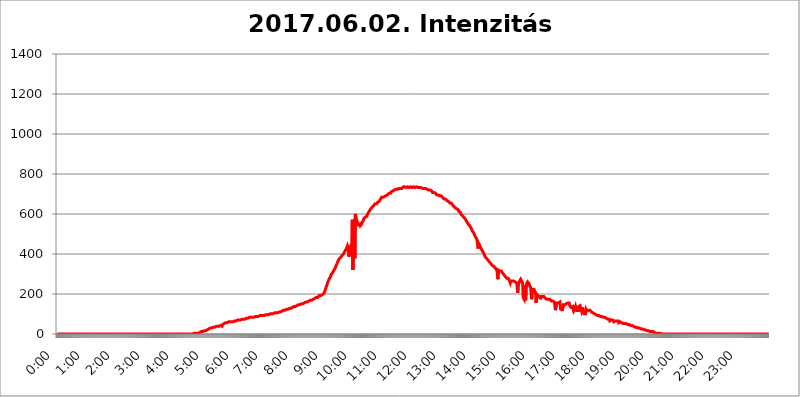
| Category | 2017.06.02. Intenzitás [W/m^2] |
|---|---|
| 0.0 | 0 |
| 0.0006944444444444445 | 0 |
| 0.001388888888888889 | 0 |
| 0.0020833333333333333 | 0 |
| 0.002777777777777778 | 0 |
| 0.003472222222222222 | 0 |
| 0.004166666666666667 | 0 |
| 0.004861111111111111 | 0 |
| 0.005555555555555556 | 0 |
| 0.0062499999999999995 | 0 |
| 0.006944444444444444 | 0 |
| 0.007638888888888889 | 0 |
| 0.008333333333333333 | 0 |
| 0.009027777777777779 | 0 |
| 0.009722222222222222 | 0 |
| 0.010416666666666666 | 0 |
| 0.011111111111111112 | 0 |
| 0.011805555555555555 | 0 |
| 0.012499999999999999 | 0 |
| 0.013194444444444444 | 0 |
| 0.013888888888888888 | 0 |
| 0.014583333333333332 | 0 |
| 0.015277777777777777 | 0 |
| 0.015972222222222224 | 0 |
| 0.016666666666666666 | 0 |
| 0.017361111111111112 | 0 |
| 0.018055555555555557 | 0 |
| 0.01875 | 0 |
| 0.019444444444444445 | 0 |
| 0.02013888888888889 | 0 |
| 0.020833333333333332 | 0 |
| 0.02152777777777778 | 0 |
| 0.022222222222222223 | 0 |
| 0.02291666666666667 | 0 |
| 0.02361111111111111 | 0 |
| 0.024305555555555556 | 0 |
| 0.024999999999999998 | 0 |
| 0.025694444444444447 | 0 |
| 0.02638888888888889 | 0 |
| 0.027083333333333334 | 0 |
| 0.027777777777777776 | 0 |
| 0.02847222222222222 | 0 |
| 0.029166666666666664 | 0 |
| 0.029861111111111113 | 0 |
| 0.030555555555555555 | 0 |
| 0.03125 | 0 |
| 0.03194444444444445 | 0 |
| 0.03263888888888889 | 0 |
| 0.03333333333333333 | 0 |
| 0.034027777777777775 | 0 |
| 0.034722222222222224 | 0 |
| 0.035416666666666666 | 0 |
| 0.036111111111111115 | 0 |
| 0.03680555555555556 | 0 |
| 0.0375 | 0 |
| 0.03819444444444444 | 0 |
| 0.03888888888888889 | 0 |
| 0.03958333333333333 | 0 |
| 0.04027777777777778 | 0 |
| 0.04097222222222222 | 0 |
| 0.041666666666666664 | 0 |
| 0.042361111111111106 | 0 |
| 0.04305555555555556 | 0 |
| 0.043750000000000004 | 0 |
| 0.044444444444444446 | 0 |
| 0.04513888888888889 | 0 |
| 0.04583333333333334 | 0 |
| 0.04652777777777778 | 0 |
| 0.04722222222222222 | 0 |
| 0.04791666666666666 | 0 |
| 0.04861111111111111 | 0 |
| 0.049305555555555554 | 0 |
| 0.049999999999999996 | 0 |
| 0.05069444444444445 | 0 |
| 0.051388888888888894 | 0 |
| 0.052083333333333336 | 0 |
| 0.05277777777777778 | 0 |
| 0.05347222222222222 | 0 |
| 0.05416666666666667 | 0 |
| 0.05486111111111111 | 0 |
| 0.05555555555555555 | 0 |
| 0.05625 | 0 |
| 0.05694444444444444 | 0 |
| 0.057638888888888885 | 0 |
| 0.05833333333333333 | 0 |
| 0.05902777777777778 | 0 |
| 0.059722222222222225 | 0 |
| 0.06041666666666667 | 0 |
| 0.061111111111111116 | 0 |
| 0.06180555555555556 | 0 |
| 0.0625 | 0 |
| 0.06319444444444444 | 0 |
| 0.06388888888888888 | 0 |
| 0.06458333333333334 | 0 |
| 0.06527777777777778 | 0 |
| 0.06597222222222222 | 0 |
| 0.06666666666666667 | 0 |
| 0.06736111111111111 | 0 |
| 0.06805555555555555 | 0 |
| 0.06874999999999999 | 0 |
| 0.06944444444444443 | 0 |
| 0.07013888888888889 | 0 |
| 0.07083333333333333 | 0 |
| 0.07152777777777779 | 0 |
| 0.07222222222222223 | 0 |
| 0.07291666666666667 | 0 |
| 0.07361111111111111 | 0 |
| 0.07430555555555556 | 0 |
| 0.075 | 0 |
| 0.07569444444444444 | 0 |
| 0.0763888888888889 | 0 |
| 0.07708333333333334 | 0 |
| 0.07777777777777778 | 0 |
| 0.07847222222222222 | 0 |
| 0.07916666666666666 | 0 |
| 0.0798611111111111 | 0 |
| 0.08055555555555556 | 0 |
| 0.08125 | 0 |
| 0.08194444444444444 | 0 |
| 0.08263888888888889 | 0 |
| 0.08333333333333333 | 0 |
| 0.08402777777777777 | 0 |
| 0.08472222222222221 | 0 |
| 0.08541666666666665 | 0 |
| 0.08611111111111112 | 0 |
| 0.08680555555555557 | 0 |
| 0.08750000000000001 | 0 |
| 0.08819444444444445 | 0 |
| 0.08888888888888889 | 0 |
| 0.08958333333333333 | 0 |
| 0.09027777777777778 | 0 |
| 0.09097222222222222 | 0 |
| 0.09166666666666667 | 0 |
| 0.09236111111111112 | 0 |
| 0.09305555555555556 | 0 |
| 0.09375 | 0 |
| 0.09444444444444444 | 0 |
| 0.09513888888888888 | 0 |
| 0.09583333333333333 | 0 |
| 0.09652777777777777 | 0 |
| 0.09722222222222222 | 0 |
| 0.09791666666666667 | 0 |
| 0.09861111111111111 | 0 |
| 0.09930555555555555 | 0 |
| 0.09999999999999999 | 0 |
| 0.10069444444444443 | 0 |
| 0.1013888888888889 | 0 |
| 0.10208333333333335 | 0 |
| 0.10277777777777779 | 0 |
| 0.10347222222222223 | 0 |
| 0.10416666666666667 | 0 |
| 0.10486111111111111 | 0 |
| 0.10555555555555556 | 0 |
| 0.10625 | 0 |
| 0.10694444444444444 | 0 |
| 0.1076388888888889 | 0 |
| 0.10833333333333334 | 0 |
| 0.10902777777777778 | 0 |
| 0.10972222222222222 | 0 |
| 0.1111111111111111 | 0 |
| 0.11180555555555556 | 0 |
| 0.11180555555555556 | 0 |
| 0.1125 | 0 |
| 0.11319444444444444 | 0 |
| 0.11388888888888889 | 0 |
| 0.11458333333333333 | 0 |
| 0.11527777777777777 | 0 |
| 0.11597222222222221 | 0 |
| 0.11666666666666665 | 0 |
| 0.1173611111111111 | 0 |
| 0.11805555555555557 | 0 |
| 0.11944444444444445 | 0 |
| 0.12013888888888889 | 0 |
| 0.12083333333333333 | 0 |
| 0.12152777777777778 | 0 |
| 0.12222222222222223 | 0 |
| 0.12291666666666667 | 0 |
| 0.12291666666666667 | 0 |
| 0.12361111111111112 | 0 |
| 0.12430555555555556 | 0 |
| 0.125 | 0 |
| 0.12569444444444444 | 0 |
| 0.12638888888888888 | 0 |
| 0.12708333333333333 | 0 |
| 0.16875 | 0 |
| 0.12847222222222224 | 0 |
| 0.12916666666666668 | 0 |
| 0.12986111111111112 | 0 |
| 0.13055555555555556 | 0 |
| 0.13125 | 0 |
| 0.13194444444444445 | 0 |
| 0.1326388888888889 | 0 |
| 0.13333333333333333 | 0 |
| 0.13402777777777777 | 0 |
| 0.13402777777777777 | 0 |
| 0.13472222222222222 | 0 |
| 0.13541666666666666 | 0 |
| 0.1361111111111111 | 0 |
| 0.13749999999999998 | 0 |
| 0.13819444444444443 | 0 |
| 0.1388888888888889 | 0 |
| 0.13958333333333334 | 0 |
| 0.14027777777777778 | 0 |
| 0.14097222222222222 | 0 |
| 0.14166666666666666 | 0 |
| 0.1423611111111111 | 0 |
| 0.14305555555555557 | 0 |
| 0.14375000000000002 | 0 |
| 0.14444444444444446 | 0 |
| 0.1451388888888889 | 0 |
| 0.1451388888888889 | 0 |
| 0.14652777777777778 | 0 |
| 0.14722222222222223 | 0 |
| 0.14791666666666667 | 0 |
| 0.1486111111111111 | 0 |
| 0.14930555555555555 | 0 |
| 0.15 | 0 |
| 0.15069444444444444 | 0 |
| 0.15138888888888888 | 0 |
| 0.15208333333333332 | 0 |
| 0.15277777777777776 | 0 |
| 0.15347222222222223 | 0 |
| 0.15416666666666667 | 0 |
| 0.15486111111111112 | 0 |
| 0.15555555555555556 | 0 |
| 0.15625 | 0 |
| 0.15694444444444444 | 0 |
| 0.15763888888888888 | 0 |
| 0.15833333333333333 | 0 |
| 0.15902777777777777 | 0 |
| 0.15972222222222224 | 0 |
| 0.16041666666666668 | 0 |
| 0.16111111111111112 | 0 |
| 0.16180555555555556 | 0 |
| 0.1625 | 0 |
| 0.16319444444444445 | 0 |
| 0.1638888888888889 | 0 |
| 0.16458333333333333 | 0 |
| 0.16527777777777777 | 0 |
| 0.16597222222222222 | 0 |
| 0.16666666666666666 | 0 |
| 0.1673611111111111 | 0 |
| 0.16805555555555554 | 0 |
| 0.16874999999999998 | 0 |
| 0.16944444444444443 | 0 |
| 0.17013888888888887 | 0 |
| 0.1708333333333333 | 0 |
| 0.17152777777777775 | 0 |
| 0.17222222222222225 | 0 |
| 0.1729166666666667 | 0 |
| 0.17361111111111113 | 0 |
| 0.17430555555555557 | 0 |
| 0.17500000000000002 | 0 |
| 0.17569444444444446 | 0 |
| 0.1763888888888889 | 0 |
| 0.17708333333333334 | 0 |
| 0.17777777777777778 | 0 |
| 0.17847222222222223 | 0 |
| 0.17916666666666667 | 0 |
| 0.1798611111111111 | 0 |
| 0.18055555555555555 | 0 |
| 0.18125 | 0 |
| 0.18194444444444444 | 0 |
| 0.1826388888888889 | 0 |
| 0.18333333333333335 | 0 |
| 0.1840277777777778 | 0 |
| 0.18472222222222223 | 0 |
| 0.18541666666666667 | 0 |
| 0.18611111111111112 | 0 |
| 0.18680555555555556 | 0 |
| 0.1875 | 0 |
| 0.18819444444444444 | 0 |
| 0.18888888888888888 | 0 |
| 0.18958333333333333 | 0 |
| 0.19027777777777777 | 0 |
| 0.1909722222222222 | 0 |
| 0.19166666666666665 | 3.525 |
| 0.19236111111111112 | 3.525 |
| 0.19305555555555554 | 3.525 |
| 0.19375 | 3.525 |
| 0.19444444444444445 | 3.525 |
| 0.1951388888888889 | 3.525 |
| 0.19583333333333333 | 3.525 |
| 0.19652777777777777 | 3.525 |
| 0.19722222222222222 | 3.525 |
| 0.19791666666666666 | 3.525 |
| 0.1986111111111111 | 7.887 |
| 0.19930555555555554 | 7.887 |
| 0.19999999999999998 | 7.887 |
| 0.20069444444444443 | 7.887 |
| 0.20138888888888887 | 12.257 |
| 0.2020833333333333 | 12.257 |
| 0.2027777777777778 | 12.257 |
| 0.2034722222222222 | 12.257 |
| 0.2041666666666667 | 12.257 |
| 0.20486111111111113 | 12.257 |
| 0.20555555555555557 | 12.257 |
| 0.20625000000000002 | 16.636 |
| 0.20694444444444446 | 16.636 |
| 0.2076388888888889 | 16.636 |
| 0.20833333333333334 | 16.636 |
| 0.20902777777777778 | 21.024 |
| 0.20972222222222223 | 21.024 |
| 0.21041666666666667 | 21.024 |
| 0.2111111111111111 | 21.024 |
| 0.21180555555555555 | 21.024 |
| 0.2125 | 25.419 |
| 0.21319444444444444 | 25.419 |
| 0.2138888888888889 | 29.823 |
| 0.21458333333333335 | 29.823 |
| 0.2152777777777778 | 29.823 |
| 0.21597222222222223 | 29.823 |
| 0.21666666666666667 | 29.823 |
| 0.21736111111111112 | 29.823 |
| 0.21805555555555556 | 29.823 |
| 0.21875 | 34.234 |
| 0.21944444444444444 | 34.234 |
| 0.22013888888888888 | 34.234 |
| 0.22083333333333333 | 34.234 |
| 0.22152777777777777 | 38.653 |
| 0.2222222222222222 | 38.653 |
| 0.22291666666666665 | 38.653 |
| 0.2236111111111111 | 38.653 |
| 0.22430555555555556 | 38.653 |
| 0.225 | 38.653 |
| 0.22569444444444445 | 38.653 |
| 0.2263888888888889 | 38.653 |
| 0.22708333333333333 | 38.653 |
| 0.22777777777777777 | 38.653 |
| 0.22847222222222222 | 43.079 |
| 0.22916666666666666 | 43.079 |
| 0.2298611111111111 | 38.653 |
| 0.23055555555555554 | 38.653 |
| 0.23124999999999998 | 38.653 |
| 0.23194444444444443 | 47.511 |
| 0.23263888888888887 | 51.951 |
| 0.2333333333333333 | 51.951 |
| 0.2340277777777778 | 51.951 |
| 0.2347222222222222 | 51.951 |
| 0.2354166666666667 | 56.398 |
| 0.23611111111111113 | 56.398 |
| 0.23680555555555557 | 56.398 |
| 0.23750000000000002 | 56.398 |
| 0.23819444444444446 | 56.398 |
| 0.2388888888888889 | 56.398 |
| 0.23958333333333334 | 60.85 |
| 0.24027777777777778 | 60.85 |
| 0.24097222222222223 | 60.85 |
| 0.24166666666666667 | 60.85 |
| 0.2423611111111111 | 60.85 |
| 0.24305555555555555 | 60.85 |
| 0.24375 | 60.85 |
| 0.24444444444444446 | 60.85 |
| 0.24513888888888888 | 65.31 |
| 0.24583333333333335 | 65.31 |
| 0.2465277777777778 | 60.85 |
| 0.24722222222222223 | 65.31 |
| 0.24791666666666667 | 65.31 |
| 0.24861111111111112 | 65.31 |
| 0.24930555555555556 | 65.31 |
| 0.25 | 65.31 |
| 0.25069444444444444 | 65.31 |
| 0.2513888888888889 | 69.775 |
| 0.2520833333333333 | 69.775 |
| 0.25277777777777777 | 69.775 |
| 0.2534722222222222 | 69.775 |
| 0.25416666666666665 | 69.775 |
| 0.2548611111111111 | 69.775 |
| 0.2555555555555556 | 69.775 |
| 0.25625000000000003 | 74.246 |
| 0.2569444444444445 | 69.775 |
| 0.2576388888888889 | 74.246 |
| 0.25833333333333336 | 74.246 |
| 0.2590277777777778 | 74.246 |
| 0.25972222222222224 | 74.246 |
| 0.2604166666666667 | 74.246 |
| 0.2611111111111111 | 74.246 |
| 0.26180555555555557 | 74.246 |
| 0.2625 | 74.246 |
| 0.26319444444444445 | 74.246 |
| 0.2638888888888889 | 78.722 |
| 0.26458333333333334 | 78.722 |
| 0.2652777777777778 | 78.722 |
| 0.2659722222222222 | 78.722 |
| 0.26666666666666666 | 78.722 |
| 0.2673611111111111 | 78.722 |
| 0.26805555555555555 | 78.722 |
| 0.26875 | 78.722 |
| 0.26944444444444443 | 83.205 |
| 0.2701388888888889 | 78.722 |
| 0.2708333333333333 | 83.205 |
| 0.27152777777777776 | 83.205 |
| 0.2722222222222222 | 83.205 |
| 0.27291666666666664 | 83.205 |
| 0.2736111111111111 | 83.205 |
| 0.2743055555555555 | 83.205 |
| 0.27499999999999997 | 83.205 |
| 0.27569444444444446 | 83.205 |
| 0.27638888888888885 | 83.205 |
| 0.27708333333333335 | 87.692 |
| 0.2777777777777778 | 87.692 |
| 0.27847222222222223 | 87.692 |
| 0.2791666666666667 | 87.692 |
| 0.2798611111111111 | 87.692 |
| 0.28055555555555556 | 87.692 |
| 0.28125 | 87.692 |
| 0.28194444444444444 | 87.692 |
| 0.2826388888888889 | 87.692 |
| 0.2833333333333333 | 87.692 |
| 0.28402777777777777 | 92.184 |
| 0.2847222222222222 | 87.692 |
| 0.28541666666666665 | 92.184 |
| 0.28611111111111115 | 92.184 |
| 0.28680555555555554 | 92.184 |
| 0.28750000000000003 | 92.184 |
| 0.2881944444444445 | 92.184 |
| 0.2888888888888889 | 92.184 |
| 0.28958333333333336 | 92.184 |
| 0.2902777777777778 | 92.184 |
| 0.29097222222222224 | 92.184 |
| 0.2916666666666667 | 96.682 |
| 0.2923611111111111 | 96.682 |
| 0.29305555555555557 | 96.682 |
| 0.29375 | 96.682 |
| 0.29444444444444445 | 96.682 |
| 0.2951388888888889 | 96.682 |
| 0.29583333333333334 | 96.682 |
| 0.2965277777777778 | 96.682 |
| 0.2972222222222222 | 96.682 |
| 0.29791666666666666 | 101.184 |
| 0.2986111111111111 | 101.184 |
| 0.29930555555555555 | 101.184 |
| 0.3 | 101.184 |
| 0.30069444444444443 | 101.184 |
| 0.3013888888888889 | 101.184 |
| 0.3020833333333333 | 101.184 |
| 0.30277777777777776 | 101.184 |
| 0.3034722222222222 | 101.184 |
| 0.30416666666666664 | 101.184 |
| 0.3048611111111111 | 105.69 |
| 0.3055555555555555 | 101.184 |
| 0.30624999999999997 | 105.69 |
| 0.3069444444444444 | 105.69 |
| 0.3076388888888889 | 105.69 |
| 0.30833333333333335 | 105.69 |
| 0.3090277777777778 | 105.69 |
| 0.30972222222222223 | 105.69 |
| 0.3104166666666667 | 110.201 |
| 0.3111111111111111 | 110.201 |
| 0.31180555555555556 | 110.201 |
| 0.3125 | 110.201 |
| 0.31319444444444444 | 110.201 |
| 0.3138888888888889 | 114.716 |
| 0.3145833333333333 | 110.201 |
| 0.31527777777777777 | 114.716 |
| 0.3159722222222222 | 114.716 |
| 0.31666666666666665 | 119.235 |
| 0.31736111111111115 | 119.235 |
| 0.31805555555555554 | 119.235 |
| 0.31875000000000003 | 119.235 |
| 0.3194444444444445 | 119.235 |
| 0.3201388888888889 | 119.235 |
| 0.32083333333333336 | 119.235 |
| 0.3215277777777778 | 123.758 |
| 0.32222222222222224 | 123.758 |
| 0.3229166666666667 | 123.758 |
| 0.3236111111111111 | 123.758 |
| 0.32430555555555557 | 123.758 |
| 0.325 | 128.284 |
| 0.32569444444444445 | 128.284 |
| 0.3263888888888889 | 128.284 |
| 0.32708333333333334 | 128.284 |
| 0.3277777777777778 | 128.284 |
| 0.3284722222222222 | 128.284 |
| 0.32916666666666666 | 128.284 |
| 0.3298611111111111 | 132.814 |
| 0.33055555555555555 | 132.814 |
| 0.33125 | 132.814 |
| 0.33194444444444443 | 137.347 |
| 0.3326388888888889 | 137.347 |
| 0.3333333333333333 | 137.347 |
| 0.3340277777777778 | 137.347 |
| 0.3347222222222222 | 137.347 |
| 0.3354166666666667 | 141.884 |
| 0.3361111111111111 | 141.884 |
| 0.3368055555555556 | 141.884 |
| 0.33749999999999997 | 141.884 |
| 0.33819444444444446 | 146.423 |
| 0.33888888888888885 | 146.423 |
| 0.33958333333333335 | 146.423 |
| 0.34027777777777773 | 146.423 |
| 0.34097222222222223 | 146.423 |
| 0.3416666666666666 | 146.423 |
| 0.3423611111111111 | 150.964 |
| 0.3430555555555555 | 150.964 |
| 0.34375 | 150.964 |
| 0.3444444444444445 | 150.964 |
| 0.3451388888888889 | 155.509 |
| 0.3458333333333334 | 155.509 |
| 0.34652777777777777 | 155.509 |
| 0.34722222222222227 | 155.509 |
| 0.34791666666666665 | 155.509 |
| 0.34861111111111115 | 160.056 |
| 0.34930555555555554 | 160.056 |
| 0.35000000000000003 | 160.056 |
| 0.3506944444444444 | 160.056 |
| 0.3513888888888889 | 164.605 |
| 0.3520833333333333 | 164.605 |
| 0.3527777777777778 | 164.605 |
| 0.3534722222222222 | 164.605 |
| 0.3541666666666667 | 164.605 |
| 0.3548611111111111 | 169.156 |
| 0.35555555555555557 | 169.156 |
| 0.35625 | 169.156 |
| 0.35694444444444445 | 169.156 |
| 0.3576388888888889 | 173.709 |
| 0.35833333333333334 | 173.709 |
| 0.3590277777777778 | 173.709 |
| 0.3597222222222222 | 173.709 |
| 0.36041666666666666 | 178.264 |
| 0.3611111111111111 | 178.264 |
| 0.36180555555555555 | 178.264 |
| 0.3625 | 178.264 |
| 0.36319444444444443 | 182.82 |
| 0.3638888888888889 | 182.82 |
| 0.3645833333333333 | 182.82 |
| 0.3652777777777778 | 182.82 |
| 0.3659722222222222 | 182.82 |
| 0.3666666666666667 | 187.378 |
| 0.3673611111111111 | 191.937 |
| 0.3680555555555556 | 191.937 |
| 0.36874999999999997 | 191.937 |
| 0.36944444444444446 | 191.937 |
| 0.37013888888888885 | 191.937 |
| 0.37083333333333335 | 196.497 |
| 0.37152777777777773 | 196.497 |
| 0.37222222222222223 | 196.497 |
| 0.3729166666666666 | 196.497 |
| 0.3736111111111111 | 201.058 |
| 0.3743055555555555 | 205.62 |
| 0.375 | 210.182 |
| 0.3756944444444445 | 219.309 |
| 0.3763888888888889 | 223.873 |
| 0.3770833333333334 | 233 |
| 0.37777777777777777 | 237.564 |
| 0.37847222222222227 | 246.689 |
| 0.37916666666666665 | 255.813 |
| 0.37986111111111115 | 260.373 |
| 0.38055555555555554 | 269.49 |
| 0.38125000000000003 | 274.047 |
| 0.3819444444444444 | 278.603 |
| 0.3826388888888889 | 283.156 |
| 0.3833333333333333 | 287.709 |
| 0.3840277777777778 | 296.808 |
| 0.3847222222222222 | 296.808 |
| 0.3854166666666667 | 301.354 |
| 0.3861111111111111 | 305.898 |
| 0.38680555555555557 | 310.44 |
| 0.3875 | 314.98 |
| 0.38819444444444445 | 319.517 |
| 0.3888888888888889 | 324.052 |
| 0.38958333333333334 | 328.584 |
| 0.3902777777777778 | 333.113 |
| 0.3909722222222222 | 342.162 |
| 0.39166666666666666 | 342.162 |
| 0.3923611111111111 | 351.198 |
| 0.39305555555555555 | 355.712 |
| 0.39375 | 364.728 |
| 0.39444444444444443 | 369.23 |
| 0.3951388888888889 | 373.729 |
| 0.3958333333333333 | 378.224 |
| 0.3965277777777778 | 378.224 |
| 0.3972222222222222 | 382.715 |
| 0.3979166666666667 | 387.202 |
| 0.3986111111111111 | 387.202 |
| 0.3993055555555556 | 391.685 |
| 0.39999999999999997 | 396.164 |
| 0.40069444444444446 | 396.164 |
| 0.40138888888888885 | 400.638 |
| 0.40208333333333335 | 405.108 |
| 0.40277777777777773 | 409.574 |
| 0.40347222222222223 | 414.035 |
| 0.4041666666666666 | 418.492 |
| 0.4048611111111111 | 422.943 |
| 0.4055555555555555 | 427.39 |
| 0.40625 | 431.833 |
| 0.4069444444444445 | 440.702 |
| 0.4076388888888889 | 431.833 |
| 0.4083333333333334 | 440.702 |
| 0.40902777777777777 | 387.202 |
| 0.40972222222222227 | 387.202 |
| 0.41041666666666665 | 427.39 |
| 0.41111111111111115 | 427.39 |
| 0.41180555555555554 | 400.638 |
| 0.41250000000000003 | 449.551 |
| 0.4131944444444444 | 391.685 |
| 0.4138888888888889 | 571.049 |
| 0.4145833333333333 | 319.517 |
| 0.4152777777777778 | 405.108 |
| 0.4159722222222222 | 391.685 |
| 0.4166666666666667 | 562.53 |
| 0.4173611111111111 | 378.224 |
| 0.41805555555555557 | 600.661 |
| 0.41875 | 588.009 |
| 0.41944444444444445 | 575.299 |
| 0.4201388888888889 | 566.793 |
| 0.42083333333333334 | 566.793 |
| 0.4215277777777778 | 562.53 |
| 0.4222222222222222 | 545.416 |
| 0.42291666666666666 | 549.704 |
| 0.4236111111111111 | 549.704 |
| 0.42430555555555555 | 549.704 |
| 0.425 | 541.121 |
| 0.42569444444444443 | 545.416 |
| 0.4263888888888889 | 545.416 |
| 0.4270833333333333 | 549.704 |
| 0.4277777777777778 | 558.261 |
| 0.4284722222222222 | 562.53 |
| 0.4291666666666667 | 566.793 |
| 0.4298611111111111 | 575.299 |
| 0.4305555555555556 | 575.299 |
| 0.43124999999999997 | 579.542 |
| 0.43194444444444446 | 583.779 |
| 0.43263888888888885 | 583.779 |
| 0.43333333333333335 | 583.779 |
| 0.43402777777777773 | 588.009 |
| 0.43472222222222223 | 596.45 |
| 0.4354166666666666 | 596.45 |
| 0.4361111111111111 | 600.661 |
| 0.4368055555555555 | 609.062 |
| 0.4375 | 613.252 |
| 0.4381944444444445 | 617.436 |
| 0.4388888888888889 | 621.613 |
| 0.4395833333333334 | 625.784 |
| 0.44027777777777777 | 625.784 |
| 0.44097222222222227 | 629.948 |
| 0.44166666666666665 | 634.105 |
| 0.44236111111111115 | 634.105 |
| 0.44305555555555554 | 638.256 |
| 0.44375000000000003 | 642.4 |
| 0.4444444444444444 | 642.4 |
| 0.4451388888888889 | 646.537 |
| 0.4458333333333333 | 650.667 |
| 0.4465277777777778 | 650.667 |
| 0.4472222222222222 | 650.667 |
| 0.4479166666666667 | 650.667 |
| 0.4486111111111111 | 650.667 |
| 0.44930555555555557 | 658.909 |
| 0.45 | 658.909 |
| 0.45069444444444445 | 663.019 |
| 0.4513888888888889 | 663.019 |
| 0.45208333333333334 | 667.123 |
| 0.4527777777777778 | 671.22 |
| 0.4534722222222222 | 675.311 |
| 0.45416666666666666 | 675.311 |
| 0.4548611111111111 | 683.473 |
| 0.45555555555555555 | 679.395 |
| 0.45625 | 683.473 |
| 0.45694444444444443 | 683.473 |
| 0.4576388888888889 | 687.544 |
| 0.4583333333333333 | 687.544 |
| 0.4590277777777778 | 687.544 |
| 0.4597222222222222 | 687.544 |
| 0.4604166666666667 | 687.544 |
| 0.4611111111111111 | 691.608 |
| 0.4618055555555556 | 691.608 |
| 0.46249999999999997 | 695.666 |
| 0.46319444444444446 | 695.666 |
| 0.46388888888888885 | 695.666 |
| 0.46458333333333335 | 699.717 |
| 0.46527777777777773 | 703.762 |
| 0.46597222222222223 | 703.762 |
| 0.4666666666666666 | 703.762 |
| 0.4673611111111111 | 703.762 |
| 0.4680555555555555 | 707.8 |
| 0.46875 | 711.832 |
| 0.4694444444444445 | 711.832 |
| 0.4701388888888889 | 715.858 |
| 0.4708333333333334 | 715.858 |
| 0.47152777777777777 | 715.858 |
| 0.47222222222222227 | 719.877 |
| 0.47291666666666665 | 719.877 |
| 0.47361111111111115 | 719.877 |
| 0.47430555555555554 | 719.877 |
| 0.47500000000000003 | 723.889 |
| 0.4756944444444444 | 719.877 |
| 0.4763888888888889 | 719.877 |
| 0.4770833333333333 | 723.889 |
| 0.4777777777777778 | 727.896 |
| 0.4784722222222222 | 727.896 |
| 0.4791666666666667 | 727.896 |
| 0.4798611111111111 | 727.896 |
| 0.48055555555555557 | 727.896 |
| 0.48125 | 727.896 |
| 0.48194444444444445 | 727.896 |
| 0.4826388888888889 | 731.896 |
| 0.48333333333333334 | 727.896 |
| 0.4840277777777778 | 731.896 |
| 0.4847222222222222 | 731.896 |
| 0.48541666666666666 | 735.89 |
| 0.4861111111111111 | 735.89 |
| 0.48680555555555555 | 735.89 |
| 0.4875 | 735.89 |
| 0.48819444444444443 | 735.89 |
| 0.4888888888888889 | 735.89 |
| 0.4895833333333333 | 731.896 |
| 0.4902777777777778 | 735.89 |
| 0.4909722222222222 | 735.89 |
| 0.4916666666666667 | 735.89 |
| 0.4923611111111111 | 735.89 |
| 0.4930555555555556 | 735.89 |
| 0.49374999999999997 | 731.896 |
| 0.49444444444444446 | 735.89 |
| 0.49513888888888885 | 735.89 |
| 0.49583333333333335 | 735.89 |
| 0.49652777777777773 | 735.89 |
| 0.49722222222222223 | 735.89 |
| 0.4979166666666666 | 731.896 |
| 0.4986111111111111 | 735.89 |
| 0.4993055555555555 | 735.89 |
| 0.5 | 735.89 |
| 0.5006944444444444 | 735.89 |
| 0.5013888888888889 | 731.896 |
| 0.5020833333333333 | 731.896 |
| 0.5027777777777778 | 735.89 |
| 0.5034722222222222 | 735.89 |
| 0.5041666666666667 | 735.89 |
| 0.5048611111111111 | 735.89 |
| 0.5055555555555555 | 735.89 |
| 0.50625 | 731.896 |
| 0.5069444444444444 | 731.896 |
| 0.5076388888888889 | 731.896 |
| 0.5083333333333333 | 731.896 |
| 0.5090277777777777 | 731.896 |
| 0.5097222222222222 | 731.896 |
| 0.5104166666666666 | 731.896 |
| 0.5111111111111112 | 731.896 |
| 0.5118055555555555 | 727.896 |
| 0.5125000000000001 | 727.896 |
| 0.5131944444444444 | 727.896 |
| 0.513888888888889 | 727.896 |
| 0.5145833333333333 | 727.896 |
| 0.5152777777777778 | 727.896 |
| 0.5159722222222222 | 727.896 |
| 0.5166666666666667 | 727.896 |
| 0.517361111111111 | 727.896 |
| 0.5180555555555556 | 727.896 |
| 0.5187499999999999 | 723.889 |
| 0.5194444444444445 | 723.889 |
| 0.5201388888888888 | 723.889 |
| 0.5208333333333334 | 719.877 |
| 0.5215277777777778 | 719.877 |
| 0.5222222222222223 | 719.877 |
| 0.5229166666666667 | 719.877 |
| 0.5236111111111111 | 715.858 |
| 0.5243055555555556 | 715.858 |
| 0.525 | 715.858 |
| 0.5256944444444445 | 711.832 |
| 0.5263888888888889 | 707.8 |
| 0.5270833333333333 | 707.8 |
| 0.5277777777777778 | 707.8 |
| 0.5284722222222222 | 707.8 |
| 0.5291666666666667 | 707.8 |
| 0.5298611111111111 | 703.762 |
| 0.5305555555555556 | 703.762 |
| 0.53125 | 699.717 |
| 0.5319444444444444 | 695.666 |
| 0.5326388888888889 | 695.666 |
| 0.5333333333333333 | 695.666 |
| 0.5340277777777778 | 695.666 |
| 0.5347222222222222 | 695.666 |
| 0.5354166666666667 | 691.608 |
| 0.5361111111111111 | 691.608 |
| 0.5368055555555555 | 691.608 |
| 0.5375 | 691.608 |
| 0.5381944444444444 | 691.608 |
| 0.5388888888888889 | 687.544 |
| 0.5395833333333333 | 687.544 |
| 0.5402777777777777 | 683.473 |
| 0.5409722222222222 | 683.473 |
| 0.5416666666666666 | 679.395 |
| 0.5423611111111112 | 675.311 |
| 0.5430555555555555 | 675.311 |
| 0.5437500000000001 | 675.311 |
| 0.5444444444444444 | 675.311 |
| 0.545138888888889 | 675.311 |
| 0.5458333333333333 | 671.22 |
| 0.5465277777777778 | 667.123 |
| 0.5472222222222222 | 667.123 |
| 0.5479166666666667 | 663.019 |
| 0.548611111111111 | 663.019 |
| 0.5493055555555556 | 658.909 |
| 0.5499999999999999 | 658.909 |
| 0.5506944444444445 | 654.791 |
| 0.5513888888888888 | 654.791 |
| 0.5520833333333334 | 654.791 |
| 0.5527777777777778 | 654.791 |
| 0.5534722222222223 | 650.667 |
| 0.5541666666666667 | 646.537 |
| 0.5548611111111111 | 642.4 |
| 0.5555555555555556 | 642.4 |
| 0.55625 | 638.256 |
| 0.5569444444444445 | 634.105 |
| 0.5576388888888889 | 634.105 |
| 0.5583333333333333 | 629.948 |
| 0.5590277777777778 | 629.948 |
| 0.5597222222222222 | 625.784 |
| 0.5604166666666667 | 625.784 |
| 0.5611111111111111 | 625.784 |
| 0.5618055555555556 | 621.613 |
| 0.5625 | 621.613 |
| 0.5631944444444444 | 613.252 |
| 0.5638888888888889 | 613.252 |
| 0.5645833333333333 | 609.062 |
| 0.5652777777777778 | 609.062 |
| 0.5659722222222222 | 600.661 |
| 0.5666666666666667 | 600.661 |
| 0.5673611111111111 | 596.45 |
| 0.5680555555555555 | 592.233 |
| 0.56875 | 592.233 |
| 0.5694444444444444 | 588.009 |
| 0.5701388888888889 | 583.779 |
| 0.5708333333333333 | 583.779 |
| 0.5715277777777777 | 579.542 |
| 0.5722222222222222 | 575.299 |
| 0.5729166666666666 | 571.049 |
| 0.5736111111111112 | 566.793 |
| 0.5743055555555555 | 562.53 |
| 0.5750000000000001 | 558.261 |
| 0.5756944444444444 | 553.986 |
| 0.576388888888889 | 549.704 |
| 0.5770833333333333 | 549.704 |
| 0.5777777777777778 | 545.416 |
| 0.5784722222222222 | 541.121 |
| 0.5791666666666667 | 536.82 |
| 0.579861111111111 | 532.513 |
| 0.5805555555555556 | 528.2 |
| 0.5812499999999999 | 523.88 |
| 0.5819444444444445 | 515.223 |
| 0.5826388888888888 | 515.223 |
| 0.5833333333333334 | 510.885 |
| 0.5840277777777778 | 506.542 |
| 0.5847222222222223 | 502.192 |
| 0.5854166666666667 | 493.475 |
| 0.5861111111111111 | 489.108 |
| 0.5868055555555556 | 484.735 |
| 0.5875 | 480.356 |
| 0.5881944444444445 | 475.972 |
| 0.5888888888888889 | 467.187 |
| 0.5895833333333333 | 462.786 |
| 0.5902777777777778 | 427.39 |
| 0.5909722222222222 | 453.968 |
| 0.5916666666666667 | 449.551 |
| 0.5923611111111111 | 445.129 |
| 0.5930555555555556 | 436.27 |
| 0.59375 | 431.833 |
| 0.5944444444444444 | 427.39 |
| 0.5951388888888889 | 422.943 |
| 0.5958333333333333 | 418.492 |
| 0.5965277777777778 | 414.035 |
| 0.5972222222222222 | 409.574 |
| 0.5979166666666667 | 405.108 |
| 0.5986111111111111 | 400.638 |
| 0.5993055555555555 | 396.164 |
| 0.6 | 387.202 |
| 0.6006944444444444 | 387.202 |
| 0.6013888888888889 | 382.715 |
| 0.6020833333333333 | 378.224 |
| 0.6027777777777777 | 373.729 |
| 0.6034722222222222 | 373.729 |
| 0.6041666666666666 | 369.23 |
| 0.6048611111111112 | 364.728 |
| 0.6055555555555555 | 364.728 |
| 0.6062500000000001 | 360.221 |
| 0.6069444444444444 | 360.221 |
| 0.607638888888889 | 355.712 |
| 0.6083333333333333 | 351.198 |
| 0.6090277777777778 | 351.198 |
| 0.6097222222222222 | 346.682 |
| 0.6104166666666667 | 342.162 |
| 0.611111111111111 | 342.162 |
| 0.6118055555555556 | 337.639 |
| 0.6124999999999999 | 337.639 |
| 0.6131944444444445 | 333.113 |
| 0.6138888888888888 | 333.113 |
| 0.6145833333333334 | 328.584 |
| 0.6152777777777778 | 328.584 |
| 0.6159722222222223 | 324.052 |
| 0.6166666666666667 | 319.517 |
| 0.6173611111111111 | 319.517 |
| 0.6180555555555556 | 274.047 |
| 0.61875 | 319.517 |
| 0.6194444444444445 | 314.98 |
| 0.6201388888888889 | 314.98 |
| 0.6208333333333333 | 314.98 |
| 0.6215277777777778 | 314.98 |
| 0.6222222222222222 | 314.98 |
| 0.6229166666666667 | 314.98 |
| 0.6236111111111111 | 310.44 |
| 0.6243055555555556 | 305.898 |
| 0.625 | 305.898 |
| 0.6256944444444444 | 301.354 |
| 0.6263888888888889 | 296.808 |
| 0.6270833333333333 | 296.808 |
| 0.6277777777777778 | 292.259 |
| 0.6284722222222222 | 287.709 |
| 0.6291666666666667 | 287.709 |
| 0.6298611111111111 | 283.156 |
| 0.6305555555555555 | 278.603 |
| 0.63125 | 278.603 |
| 0.6319444444444444 | 278.603 |
| 0.6326388888888889 | 278.603 |
| 0.6333333333333333 | 274.047 |
| 0.6340277777777777 | 269.49 |
| 0.6347222222222222 | 264.932 |
| 0.6354166666666666 | 255.813 |
| 0.6361111111111112 | 264.932 |
| 0.6368055555555555 | 264.932 |
| 0.6375000000000001 | 264.932 |
| 0.6381944444444444 | 264.932 |
| 0.638888888888889 | 264.932 |
| 0.6395833333333333 | 264.932 |
| 0.6402777777777778 | 264.932 |
| 0.6409722222222222 | 260.373 |
| 0.6416666666666667 | 260.373 |
| 0.642361111111111 | 260.373 |
| 0.6430555555555556 | 255.813 |
| 0.6437499999999999 | 255.813 |
| 0.6444444444444445 | 255.813 |
| 0.6451388888888888 | 260.373 |
| 0.6458333333333334 | 205.62 |
| 0.6465277777777778 | 242.127 |
| 0.6472222222222223 | 251.251 |
| 0.6479166666666667 | 251.251 |
| 0.6486111111111111 | 264.932 |
| 0.6493055555555556 | 269.49 |
| 0.65 | 274.047 |
| 0.6506944444444445 | 269.49 |
| 0.6513888888888889 | 264.932 |
| 0.6520833333333333 | 260.373 |
| 0.6527777777777778 | 251.251 |
| 0.6534722222222222 | 182.82 |
| 0.6541666666666667 | 182.82 |
| 0.6548611111111111 | 173.709 |
| 0.6555555555555556 | 169.156 |
| 0.65625 | 242.127 |
| 0.6569444444444444 | 169.156 |
| 0.6576388888888889 | 219.309 |
| 0.6583333333333333 | 251.251 |
| 0.6590277777777778 | 255.813 |
| 0.6597222222222222 | 260.373 |
| 0.6604166666666667 | 260.373 |
| 0.6611111111111111 | 255.813 |
| 0.6618055555555555 | 251.251 |
| 0.6625 | 242.127 |
| 0.6631944444444444 | 237.564 |
| 0.6638888888888889 | 233 |
| 0.6645833333333333 | 228.436 |
| 0.6652777777777777 | 173.709 |
| 0.6659722222222222 | 191.937 |
| 0.6666666666666666 | 223.873 |
| 0.6673611111111111 | 223.873 |
| 0.6680555555555556 | 223.873 |
| 0.6687500000000001 | 223.873 |
| 0.6694444444444444 | 219.309 |
| 0.6701388888888888 | 210.182 |
| 0.6708333333333334 | 201.058 |
| 0.6715277777777778 | 155.509 |
| 0.6722222222222222 | 160.056 |
| 0.6729166666666666 | 196.497 |
| 0.6736111111111112 | 191.937 |
| 0.6743055555555556 | 191.937 |
| 0.6749999999999999 | 187.378 |
| 0.6756944444444444 | 187.378 |
| 0.6763888888888889 | 187.378 |
| 0.6770833333333334 | 187.378 |
| 0.6777777777777777 | 173.709 |
| 0.6784722222222223 | 187.378 |
| 0.6791666666666667 | 187.378 |
| 0.6798611111111111 | 187.378 |
| 0.6805555555555555 | 187.378 |
| 0.68125 | 187.378 |
| 0.6819444444444445 | 187.378 |
| 0.6826388888888889 | 187.378 |
| 0.6833333333333332 | 182.82 |
| 0.6840277777777778 | 182.82 |
| 0.6847222222222222 | 178.264 |
| 0.6854166666666667 | 173.709 |
| 0.686111111111111 | 173.709 |
| 0.6868055555555556 | 173.709 |
| 0.6875 | 173.709 |
| 0.6881944444444444 | 173.709 |
| 0.688888888888889 | 173.709 |
| 0.6895833333333333 | 169.156 |
| 0.6902777777777778 | 173.709 |
| 0.6909722222222222 | 173.709 |
| 0.6916666666666668 | 169.156 |
| 0.6923611111111111 | 169.156 |
| 0.6930555555555555 | 164.605 |
| 0.69375 | 164.605 |
| 0.6944444444444445 | 164.605 |
| 0.6951388888888889 | 164.605 |
| 0.6958333333333333 | 164.605 |
| 0.6965277777777777 | 160.056 |
| 0.6972222222222223 | 160.056 |
| 0.6979166666666666 | 141.884 |
| 0.6986111111111111 | 119.235 |
| 0.6993055555555556 | 119.235 |
| 0.7000000000000001 | 146.423 |
| 0.7006944444444444 | 155.509 |
| 0.7013888888888888 | 150.964 |
| 0.7020833333333334 | 155.509 |
| 0.7027777777777778 | 155.509 |
| 0.7034722222222222 | 155.509 |
| 0.7041666666666666 | 160.056 |
| 0.7048611111111112 | 160.056 |
| 0.7055555555555556 | 155.509 |
| 0.7062499999999999 | 119.235 |
| 0.7069444444444444 | 119.235 |
| 0.7076388888888889 | 132.814 |
| 0.7083333333333334 | 114.716 |
| 0.7090277777777777 | 114.716 |
| 0.7097222222222223 | 146.423 |
| 0.7104166666666667 | 146.423 |
| 0.7111111111111111 | 146.423 |
| 0.7118055555555555 | 146.423 |
| 0.7125 | 146.423 |
| 0.7131944444444445 | 146.423 |
| 0.7138888888888889 | 150.964 |
| 0.7145833333333332 | 155.509 |
| 0.7152777777777778 | 155.509 |
| 0.7159722222222222 | 155.509 |
| 0.7166666666666667 | 155.509 |
| 0.717361111111111 | 155.509 |
| 0.7180555555555556 | 155.509 |
| 0.71875 | 141.884 |
| 0.7194444444444444 | 137.347 |
| 0.720138888888889 | 146.423 |
| 0.7208333333333333 | 132.814 |
| 0.7215277777777778 | 132.814 |
| 0.7222222222222222 | 128.284 |
| 0.7229166666666668 | 137.347 |
| 0.7236111111111111 | 123.758 |
| 0.7243055555555555 | 114.716 |
| 0.725 | 110.201 |
| 0.7256944444444445 | 110.201 |
| 0.7263888888888889 | 128.284 |
| 0.7270833333333333 | 137.347 |
| 0.7277777777777777 | 137.347 |
| 0.7284722222222223 | 137.347 |
| 0.7291666666666666 | 110.201 |
| 0.7298611111111111 | 132.814 |
| 0.7305555555555556 | 110.201 |
| 0.7312500000000001 | 137.347 |
| 0.7319444444444444 | 137.347 |
| 0.7326388888888888 | 137.347 |
| 0.7333333333333334 | 141.884 |
| 0.7340277777777778 | 141.884 |
| 0.7347222222222222 | 141.884 |
| 0.7354166666666666 | 114.716 |
| 0.7361111111111112 | 110.201 |
| 0.7368055555555556 | 132.814 |
| 0.7374999999999999 | 110.201 |
| 0.7381944444444444 | 105.69 |
| 0.7388888888888889 | 101.184 |
| 0.7395833333333334 | 105.69 |
| 0.7402777777777777 | 105.69 |
| 0.7409722222222223 | 101.184 |
| 0.7416666666666667 | 123.758 |
| 0.7423611111111111 | 123.758 |
| 0.7430555555555555 | 114.716 |
| 0.74375 | 114.716 |
| 0.7444444444444445 | 119.235 |
| 0.7451388888888889 | 119.235 |
| 0.7458333333333332 | 123.758 |
| 0.7465277777777778 | 119.235 |
| 0.7472222222222222 | 119.235 |
| 0.7479166666666667 | 119.235 |
| 0.748611111111111 | 114.716 |
| 0.7493055555555556 | 110.201 |
| 0.75 | 110.201 |
| 0.7506944444444444 | 105.69 |
| 0.751388888888889 | 105.69 |
| 0.7520833333333333 | 101.184 |
| 0.7527777777777778 | 101.184 |
| 0.7534722222222222 | 101.184 |
| 0.7541666666666668 | 101.184 |
| 0.7548611111111111 | 101.184 |
| 0.7555555555555555 | 96.682 |
| 0.75625 | 96.682 |
| 0.7569444444444445 | 96.682 |
| 0.7576388888888889 | 92.184 |
| 0.7583333333333333 | 92.184 |
| 0.7590277777777777 | 92.184 |
| 0.7597222222222223 | 92.184 |
| 0.7604166666666666 | 92.184 |
| 0.7611111111111111 | 87.692 |
| 0.7618055555555556 | 87.692 |
| 0.7625000000000001 | 87.692 |
| 0.7631944444444444 | 87.692 |
| 0.7638888888888888 | 87.692 |
| 0.7645833333333334 | 87.692 |
| 0.7652777777777778 | 87.692 |
| 0.7659722222222222 | 83.205 |
| 0.7666666666666666 | 83.205 |
| 0.7673611111111112 | 83.205 |
| 0.7680555555555556 | 83.205 |
| 0.7687499999999999 | 78.722 |
| 0.7694444444444444 | 78.722 |
| 0.7701388888888889 | 78.722 |
| 0.7708333333333334 | 78.722 |
| 0.7715277777777777 | 78.722 |
| 0.7722222222222223 | 74.246 |
| 0.7729166666666667 | 74.246 |
| 0.7736111111111111 | 74.246 |
| 0.7743055555555555 | 74.246 |
| 0.775 | 65.31 |
| 0.7756944444444445 | 65.31 |
| 0.7763888888888889 | 69.775 |
| 0.7770833333333332 | 69.775 |
| 0.7777777777777778 | 69.775 |
| 0.7784722222222222 | 69.775 |
| 0.7791666666666667 | 69.775 |
| 0.779861111111111 | 65.31 |
| 0.7805555555555556 | 60.85 |
| 0.78125 | 60.85 |
| 0.7819444444444444 | 65.31 |
| 0.782638888888889 | 65.31 |
| 0.7833333333333333 | 65.31 |
| 0.7840277777777778 | 65.31 |
| 0.7847222222222222 | 65.31 |
| 0.7854166666666668 | 60.85 |
| 0.7861111111111111 | 65.31 |
| 0.7868055555555555 | 65.31 |
| 0.7875 | 56.398 |
| 0.7881944444444445 | 56.398 |
| 0.7888888888888889 | 60.85 |
| 0.7895833333333333 | 60.85 |
| 0.7902777777777777 | 60.85 |
| 0.7909722222222223 | 60.85 |
| 0.7916666666666666 | 56.398 |
| 0.7923611111111111 | 56.398 |
| 0.7930555555555556 | 56.398 |
| 0.7937500000000001 | 51.951 |
| 0.7944444444444444 | 56.398 |
| 0.7951388888888888 | 51.951 |
| 0.7958333333333334 | 51.951 |
| 0.7965277777777778 | 51.951 |
| 0.7972222222222222 | 51.951 |
| 0.7979166666666666 | 51.951 |
| 0.7986111111111112 | 47.511 |
| 0.7993055555555556 | 47.511 |
| 0.7999999999999999 | 47.511 |
| 0.8006944444444444 | 47.511 |
| 0.8013888888888889 | 47.511 |
| 0.8020833333333334 | 47.511 |
| 0.8027777777777777 | 47.511 |
| 0.8034722222222223 | 47.511 |
| 0.8041666666666667 | 43.079 |
| 0.8048611111111111 | 43.079 |
| 0.8055555555555555 | 43.079 |
| 0.80625 | 43.079 |
| 0.8069444444444445 | 38.653 |
| 0.8076388888888889 | 38.653 |
| 0.8083333333333332 | 38.653 |
| 0.8090277777777778 | 38.653 |
| 0.8097222222222222 | 38.653 |
| 0.8104166666666667 | 34.234 |
| 0.811111111111111 | 34.234 |
| 0.8118055555555556 | 34.234 |
| 0.8125 | 34.234 |
| 0.8131944444444444 | 29.823 |
| 0.813888888888889 | 29.823 |
| 0.8145833333333333 | 29.823 |
| 0.8152777777777778 | 29.823 |
| 0.8159722222222222 | 29.823 |
| 0.8166666666666668 | 29.823 |
| 0.8173611111111111 | 29.823 |
| 0.8180555555555555 | 29.823 |
| 0.81875 | 25.419 |
| 0.8194444444444445 | 25.419 |
| 0.8201388888888889 | 25.419 |
| 0.8208333333333333 | 25.419 |
| 0.8215277777777777 | 25.419 |
| 0.8222222222222223 | 21.024 |
| 0.8229166666666666 | 21.024 |
| 0.8236111111111111 | 21.024 |
| 0.8243055555555556 | 21.024 |
| 0.8250000000000001 | 21.024 |
| 0.8256944444444444 | 21.024 |
| 0.8263888888888888 | 21.024 |
| 0.8270833333333334 | 16.636 |
| 0.8277777777777778 | 16.636 |
| 0.8284722222222222 | 16.636 |
| 0.8291666666666666 | 16.636 |
| 0.8298611111111112 | 16.636 |
| 0.8305555555555556 | 16.636 |
| 0.8312499999999999 | 12.257 |
| 0.8319444444444444 | 12.257 |
| 0.8326388888888889 | 12.257 |
| 0.8333333333333334 | 12.257 |
| 0.8340277777777777 | 12.257 |
| 0.8347222222222223 | 12.257 |
| 0.8354166666666667 | 12.257 |
| 0.8361111111111111 | 7.887 |
| 0.8368055555555555 | 7.887 |
| 0.8375 | 7.887 |
| 0.8381944444444445 | 7.887 |
| 0.8388888888888889 | 7.887 |
| 0.8395833333333332 | 3.525 |
| 0.8402777777777778 | 3.525 |
| 0.8409722222222222 | 3.525 |
| 0.8416666666666667 | 3.525 |
| 0.842361111111111 | 3.525 |
| 0.8430555555555556 | 3.525 |
| 0.84375 | 3.525 |
| 0.8444444444444444 | 3.525 |
| 0.845138888888889 | 3.525 |
| 0.8458333333333333 | 3.525 |
| 0.8465277777777778 | 3.525 |
| 0.8472222222222222 | 3.525 |
| 0.8479166666666668 | 0 |
| 0.8486111111111111 | 0 |
| 0.8493055555555555 | 0 |
| 0.85 | 0 |
| 0.8506944444444445 | 0 |
| 0.8513888888888889 | 0 |
| 0.8520833333333333 | 0 |
| 0.8527777777777777 | 0 |
| 0.8534722222222223 | 0 |
| 0.8541666666666666 | 0 |
| 0.8548611111111111 | 0 |
| 0.8555555555555556 | 0 |
| 0.8562500000000001 | 0 |
| 0.8569444444444444 | 0 |
| 0.8576388888888888 | 0 |
| 0.8583333333333334 | 0 |
| 0.8590277777777778 | 0 |
| 0.8597222222222222 | 0 |
| 0.8604166666666666 | 0 |
| 0.8611111111111112 | 0 |
| 0.8618055555555556 | 0 |
| 0.8624999999999999 | 0 |
| 0.8631944444444444 | 0 |
| 0.8638888888888889 | 0 |
| 0.8645833333333334 | 0 |
| 0.8652777777777777 | 0 |
| 0.8659722222222223 | 0 |
| 0.8666666666666667 | 0 |
| 0.8673611111111111 | 0 |
| 0.8680555555555555 | 0 |
| 0.86875 | 0 |
| 0.8694444444444445 | 0 |
| 0.8701388888888889 | 0 |
| 0.8708333333333332 | 0 |
| 0.8715277777777778 | 0 |
| 0.8722222222222222 | 0 |
| 0.8729166666666667 | 0 |
| 0.873611111111111 | 0 |
| 0.8743055555555556 | 0 |
| 0.875 | 0 |
| 0.8756944444444444 | 0 |
| 0.876388888888889 | 0 |
| 0.8770833333333333 | 0 |
| 0.8777777777777778 | 0 |
| 0.8784722222222222 | 0 |
| 0.8791666666666668 | 0 |
| 0.8798611111111111 | 0 |
| 0.8805555555555555 | 0 |
| 0.88125 | 0 |
| 0.8819444444444445 | 0 |
| 0.8826388888888889 | 0 |
| 0.8833333333333333 | 0 |
| 0.8840277777777777 | 0 |
| 0.8847222222222223 | 0 |
| 0.8854166666666666 | 0 |
| 0.8861111111111111 | 0 |
| 0.8868055555555556 | 0 |
| 0.8875000000000001 | 0 |
| 0.8881944444444444 | 0 |
| 0.8888888888888888 | 0 |
| 0.8895833333333334 | 0 |
| 0.8902777777777778 | 0 |
| 0.8909722222222222 | 0 |
| 0.8916666666666666 | 0 |
| 0.8923611111111112 | 0 |
| 0.8930555555555556 | 0 |
| 0.8937499999999999 | 0 |
| 0.8944444444444444 | 0 |
| 0.8951388888888889 | 0 |
| 0.8958333333333334 | 0 |
| 0.8965277777777777 | 0 |
| 0.8972222222222223 | 0 |
| 0.8979166666666667 | 0 |
| 0.8986111111111111 | 0 |
| 0.8993055555555555 | 0 |
| 0.9 | 0 |
| 0.9006944444444445 | 0 |
| 0.9013888888888889 | 0 |
| 0.9020833333333332 | 0 |
| 0.9027777777777778 | 0 |
| 0.9034722222222222 | 0 |
| 0.9041666666666667 | 0 |
| 0.904861111111111 | 0 |
| 0.9055555555555556 | 0 |
| 0.90625 | 0 |
| 0.9069444444444444 | 0 |
| 0.907638888888889 | 0 |
| 0.9083333333333333 | 0 |
| 0.9090277777777778 | 0 |
| 0.9097222222222222 | 0 |
| 0.9104166666666668 | 0 |
| 0.9111111111111111 | 0 |
| 0.9118055555555555 | 0 |
| 0.9125 | 0 |
| 0.9131944444444445 | 0 |
| 0.9138888888888889 | 0 |
| 0.9145833333333333 | 0 |
| 0.9152777777777777 | 0 |
| 0.9159722222222223 | 0 |
| 0.9166666666666666 | 0 |
| 0.9173611111111111 | 0 |
| 0.9180555555555556 | 0 |
| 0.9187500000000001 | 0 |
| 0.9194444444444444 | 0 |
| 0.9201388888888888 | 0 |
| 0.9208333333333334 | 0 |
| 0.9215277777777778 | 0 |
| 0.9222222222222222 | 0 |
| 0.9229166666666666 | 0 |
| 0.9236111111111112 | 0 |
| 0.9243055555555556 | 0 |
| 0.9249999999999999 | 0 |
| 0.9256944444444444 | 0 |
| 0.9263888888888889 | 0 |
| 0.9270833333333334 | 0 |
| 0.9277777777777777 | 0 |
| 0.9284722222222223 | 0 |
| 0.9291666666666667 | 0 |
| 0.9298611111111111 | 0 |
| 0.9305555555555555 | 0 |
| 0.93125 | 0 |
| 0.9319444444444445 | 0 |
| 0.9326388888888889 | 0 |
| 0.9333333333333332 | 0 |
| 0.9340277777777778 | 0 |
| 0.9347222222222222 | 0 |
| 0.9354166666666667 | 0 |
| 0.936111111111111 | 0 |
| 0.9368055555555556 | 0 |
| 0.9375 | 0 |
| 0.9381944444444444 | 0 |
| 0.938888888888889 | 0 |
| 0.9395833333333333 | 0 |
| 0.9402777777777778 | 0 |
| 0.9409722222222222 | 0 |
| 0.9416666666666668 | 0 |
| 0.9423611111111111 | 0 |
| 0.9430555555555555 | 0 |
| 0.94375 | 0 |
| 0.9444444444444445 | 0 |
| 0.9451388888888889 | 0 |
| 0.9458333333333333 | 0 |
| 0.9465277777777777 | 0 |
| 0.9472222222222223 | 0 |
| 0.9479166666666666 | 0 |
| 0.9486111111111111 | 0 |
| 0.9493055555555556 | 0 |
| 0.9500000000000001 | 0 |
| 0.9506944444444444 | 0 |
| 0.9513888888888888 | 0 |
| 0.9520833333333334 | 0 |
| 0.9527777777777778 | 0 |
| 0.9534722222222222 | 0 |
| 0.9541666666666666 | 0 |
| 0.9548611111111112 | 0 |
| 0.9555555555555556 | 0 |
| 0.9562499999999999 | 0 |
| 0.9569444444444444 | 0 |
| 0.9576388888888889 | 0 |
| 0.9583333333333334 | 0 |
| 0.9590277777777777 | 0 |
| 0.9597222222222223 | 0 |
| 0.9604166666666667 | 0 |
| 0.9611111111111111 | 0 |
| 0.9618055555555555 | 0 |
| 0.9625 | 0 |
| 0.9631944444444445 | 0 |
| 0.9638888888888889 | 0 |
| 0.9645833333333332 | 0 |
| 0.9652777777777778 | 0 |
| 0.9659722222222222 | 0 |
| 0.9666666666666667 | 0 |
| 0.967361111111111 | 0 |
| 0.9680555555555556 | 0 |
| 0.96875 | 0 |
| 0.9694444444444444 | 0 |
| 0.970138888888889 | 0 |
| 0.9708333333333333 | 0 |
| 0.9715277777777778 | 0 |
| 0.9722222222222222 | 0 |
| 0.9729166666666668 | 0 |
| 0.9736111111111111 | 0 |
| 0.9743055555555555 | 0 |
| 0.975 | 0 |
| 0.9756944444444445 | 0 |
| 0.9763888888888889 | 0 |
| 0.9770833333333333 | 0 |
| 0.9777777777777777 | 0 |
| 0.9784722222222223 | 0 |
| 0.9791666666666666 | 0 |
| 0.9798611111111111 | 0 |
| 0.9805555555555556 | 0 |
| 0.9812500000000001 | 0 |
| 0.9819444444444444 | 0 |
| 0.9826388888888888 | 0 |
| 0.9833333333333334 | 0 |
| 0.9840277777777778 | 0 |
| 0.9847222222222222 | 0 |
| 0.9854166666666666 | 0 |
| 0.9861111111111112 | 0 |
| 0.9868055555555556 | 0 |
| 0.9874999999999999 | 0 |
| 0.9881944444444444 | 0 |
| 0.9888888888888889 | 0 |
| 0.9895833333333334 | 0 |
| 0.9902777777777777 | 0 |
| 0.9909722222222223 | 0 |
| 0.9916666666666667 | 0 |
| 0.9923611111111111 | 0 |
| 0.9930555555555555 | 0 |
| 0.99375 | 0 |
| 0.9944444444444445 | 0 |
| 0.9951388888888889 | 0 |
| 0.9958333333333332 | 0 |
| 0.9965277777777778 | 0 |
| 0.9972222222222222 | 0 |
| 0.9979166666666667 | 0 |
| 0.998611111111111 | 0 |
| 0.9993055555555556 | 0 |